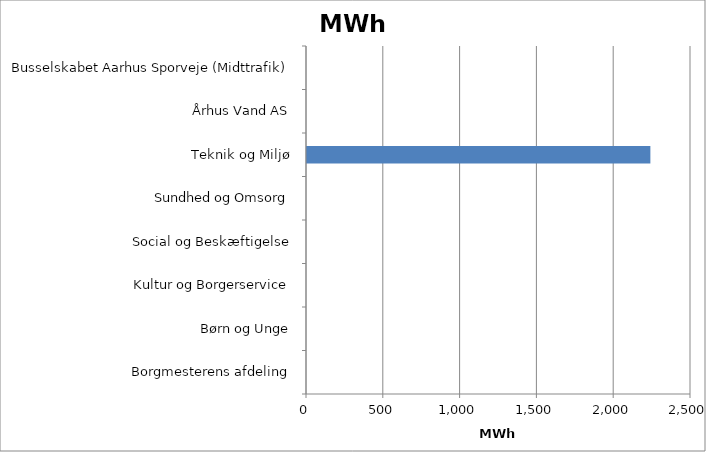
| Category | Varmeforbrug MWh |
|---|---|
| Borgmesterens afdeling | 0 |
| Børn og Unge | 0 |
| Kultur og Borgerservice | 0 |
| Social og Beskæftigelse | 0 |
| Sundhed og Omsorg | 0 |
| Teknik og Miljø | 2235.491 |
| Århus Vand AS | 0 |
| Busselskabet Aarhus Sporveje (Midttrafik) | 0 |